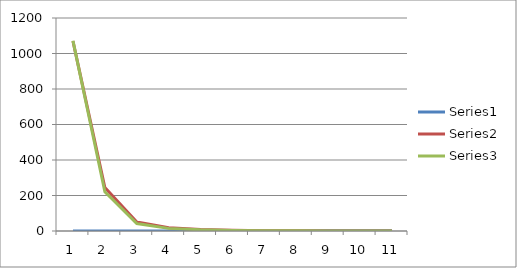
| Category | Series 0 | Series 1 | Series 2 |
|---|---|---|---|
| 0 | 0.05 | 1070 | 1072.187 |
| 1 | 0.1 | 245 | 221.005 |
| 2 | 0.2 | 51 | 42.025 |
| 3 | 0.3 | 18.4 | 14.783 |
| 4 | 0.4 | 8.2 | 6.608 |
| 5 | 0.5 | 4 | 3.314 |
| 6 | 0.6 | 2 | 1.748 |
| 7 | 0.7 | 0.97 | 0.921 |
| 8 | 0.8 | 0.41 | 0.451 |
| 9 | 0.9 | 0.13 | 0.172 |
| 10 | 1 | 0 | 0 |